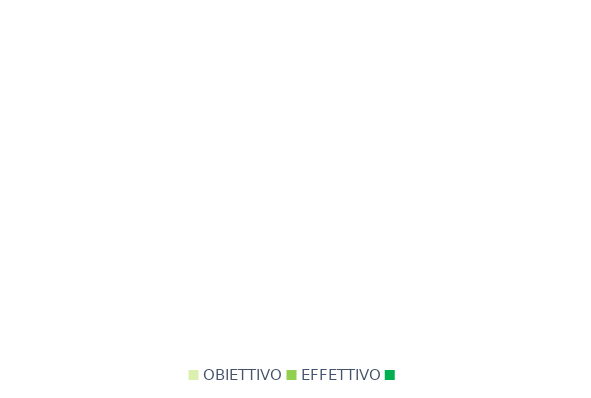
| Category | Series 0 |
|---|---|
| OBIETTIVO | 0 |
| EFFETTIVO | 0 |